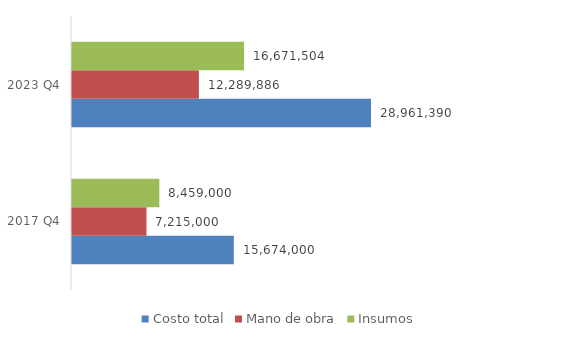
| Category | Costo total | Mano de obra | Insumos |
|---|---|---|---|
| 2017 Q4 | 15674000 | 7215000 | 8459000 |
| 2023 Q4 | 28961389.796 | 12289886 | 16671503.796 |